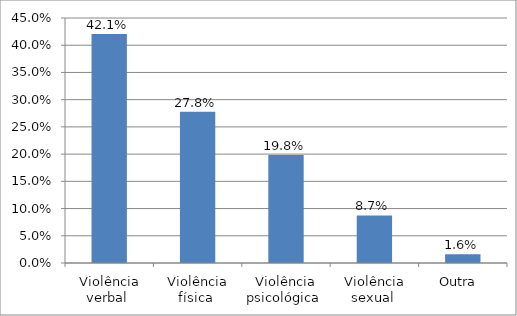
| Category | Series 0 |
|---|---|
| Violência verbal  | 0.421 |
| Violência física  | 0.278 |
| Violência psicológica  | 0.198 |
| Violência sexual  | 0.087 |
| Outra  | 0.016 |